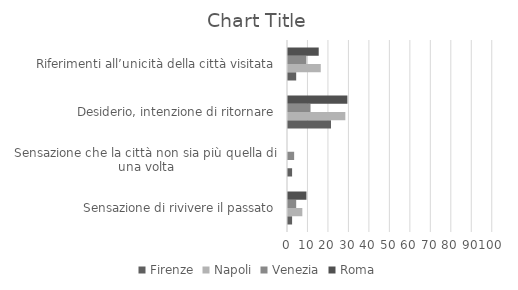
| Category | Firenze | Napoli | Venezia | Roma |
|---|---|---|---|---|
| Sensazione di rivivere il passato | 2 | 7 | 4 | 9 |
| Sensazione che la città non sia più quella di una volta | 2 | 0 | 3 | 0 |
| Desiderio, intenzione di ritornare | 21 | 28 | 11 | 29 |
| Riferimenti all’unicità della città visitata | 4 | 16 | 9 | 15 |